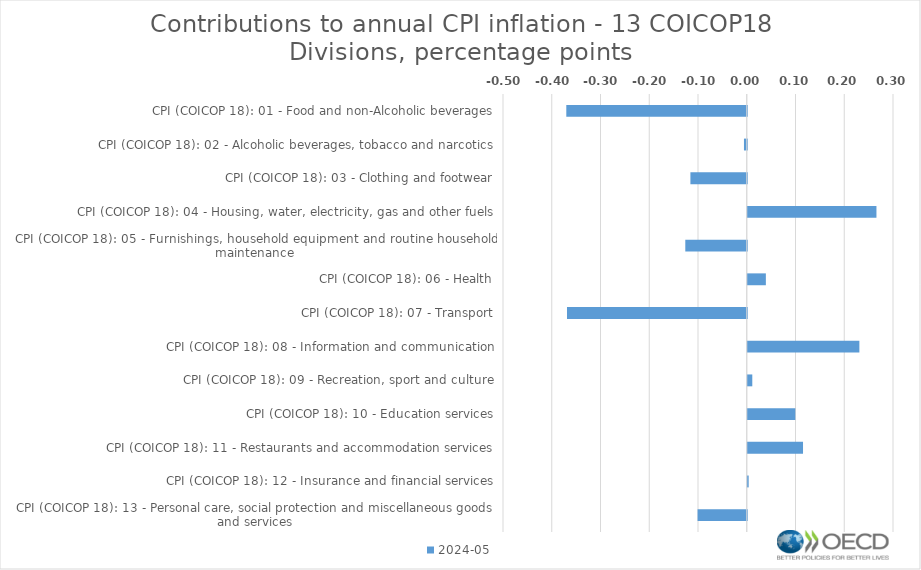
| Category | 2024-05 |
|---|---|
| CPI (COICOP 18): 01 - Food and non-Alcoholic beverages | -0.37 |
| CPI (COICOP 18): 02 - Alcoholic beverages, tobacco and narcotics | -0.006 |
| CPI (COICOP 18): 03 - Clothing and footwear | -0.116 |
| CPI (COICOP 18): 04 - Housing, water, electricity, gas and other fuels | 0.264 |
| CPI (COICOP 18): 05 - Furnishings, household equipment and routine household maintenance | -0.126 |
| CPI (COICOP 18): 06 - Health | 0.037 |
| CPI (COICOP 18): 07 - Transport | -0.369 |
| CPI (COICOP 18): 08 - Information and communication | 0.229 |
| CPI (COICOP 18): 09 - Recreation, sport and culture | 0.009 |
| CPI (COICOP 18): 10 - Education services | 0.098 |
| CPI (COICOP 18): 11 - Restaurants and accommodation services | 0.113 |
| CPI (COICOP 18): 12 - Insurance and financial services | 0.002 |
| CPI (COICOP 18): 13 - Personal care, social protection and miscellaneous goods and services | -0.101 |